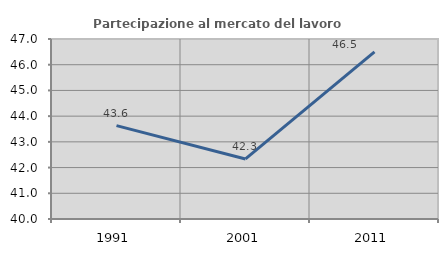
| Category | Partecipazione al mercato del lavoro  femminile |
|---|---|
| 1991.0 | 43.631 |
| 2001.0 | 42.335 |
| 2011.0 | 46.498 |